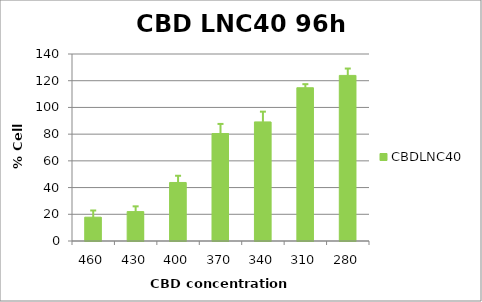
| Category | CBDLNC40 |
|---|---|
| 460.0 | 17.817 |
| 430.0 | 22.025 |
| 400.0 | 43.816 |
| 370.0 | 80.436 |
| 340.0 | 89.163 |
| 310.0 | 114.736 |
| 280.0 | 123.964 |